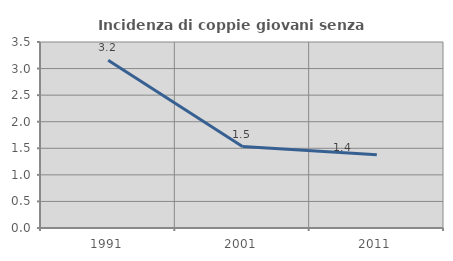
| Category | Incidenza di coppie giovani senza figli |
|---|---|
| 1991.0 | 3.155 |
| 2001.0 | 1.533 |
| 2011.0 | 1.379 |